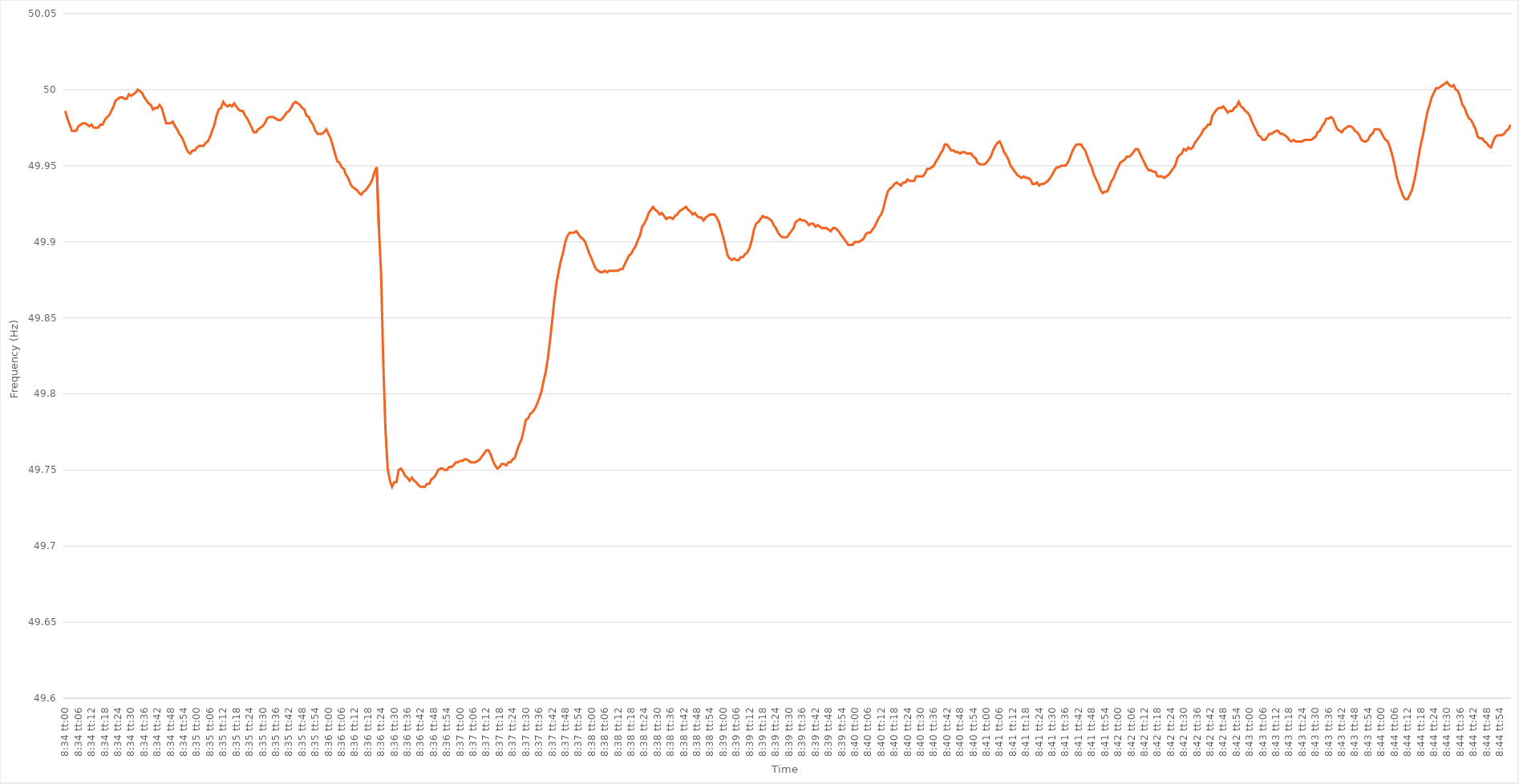
| Category | Series 0 |
|---|---|
| 0.35694444444444445 | 49.986 |
| 0.35695601851851855 | 49.981 |
| 0.3569675925925926 | 49.977 |
| 0.3569791666666667 | 49.973 |
| 0.3569907407407407 | 49.973 |
| 0.35700231481481487 | 49.973 |
| 0.3570138888888889 | 49.976 |
| 0.35702546296296295 | 49.977 |
| 0.35703703703703704 | 49.978 |
| 0.3570486111111111 | 49.978 |
| 0.3570601851851852 | 49.977 |
| 0.3570717592592592 | 49.976 |
| 0.35708333333333336 | 49.977 |
| 0.3570949074074074 | 49.975 |
| 0.3571064814814815 | 49.975 |
| 0.35711805555555554 | 49.975 |
| 0.35712962962962963 | 49.977 |
| 0.35714120370370367 | 49.977 |
| 0.3571527777777778 | 49.98 |
| 0.35716435185185186 | 49.982 |
| 0.35717592592592595 | 49.983 |
| 0.3571875 | 49.986 |
| 0.3571990740740741 | 49.989 |
| 0.3572106481481481 | 49.993 |
| 0.3572222222222223 | 49.994 |
| 0.3572337962962963 | 49.995 |
| 0.35724537037037035 | 49.995 |
| 0.35725694444444445 | 49.994 |
| 0.3572685185185185 | 49.994 |
| 0.3572800925925926 | 49.997 |
| 0.3572916666666666 | 49.996 |
| 0.35730324074074077 | 49.997 |
| 0.3573148148148148 | 49.998 |
| 0.3573263888888889 | 50 |
| 0.35733796296296294 | 49.999 |
| 0.35734953703703703 | 49.998 |
| 0.3573611111111111 | 49.995 |
| 0.3573726851851852 | 49.993 |
| 0.35738425925925926 | 49.991 |
| 0.35739583333333336 | 49.99 |
| 0.3574074074074074 | 49.987 |
| 0.3574189814814815 | 49.988 |
| 0.35743055555555553 | 49.988 |
| 0.3574421296296297 | 49.99 |
| 0.3574537037037037 | 49.988 |
| 0.3574652777777778 | 49.983 |
| 0.35747685185185185 | 49.978 |
| 0.3574884259259259 | 49.978 |
| 0.3575 | 49.978 |
| 0.357511574074074 | 49.979 |
| 0.3575231481481482 | 49.976 |
| 0.3575347222222222 | 49.974 |
| 0.3575462962962963 | 49.971 |
| 0.35755787037037035 | 49.969 |
| 0.35756944444444444 | 49.966 |
| 0.3575810185185185 | 49.962 |
| 0.35759259259259263 | 49.959 |
| 0.35760416666666667 | 49.958 |
| 0.35761574074074076 | 49.96 |
| 0.3576273148148148 | 49.96 |
| 0.3576388888888889 | 49.962 |
| 0.35765046296296293 | 49.963 |
| 0.3576620370370371 | 49.963 |
| 0.3576736111111111 | 49.963 |
| 0.3576851851851852 | 49.965 |
| 0.35769675925925926 | 49.966 |
| 0.35770833333333335 | 49.969 |
| 0.3577199074074074 | 49.973 |
| 0.35773148148148143 | 49.977 |
| 0.3577430555555556 | 49.983 |
| 0.3577546296296296 | 49.987 |
| 0.3577662037037037 | 49.988 |
| 0.35777777777777775 | 49.992 |
| 0.35778935185185184 | 49.99 |
| 0.3578009259259259 | 49.989 |
| 0.35781250000000003 | 49.99 |
| 0.35782407407407407 | 49.989 |
| 0.35783564814814817 | 49.991 |
| 0.3578472222222222 | 49.989 |
| 0.3578587962962963 | 49.987 |
| 0.35787037037037034 | 49.986 |
| 0.3578819444444445 | 49.986 |
| 0.3578935185185185 | 49.983 |
| 0.3579050925925926 | 49.981 |
| 0.35791666666666666 | 49.978 |
| 0.35792824074074076 | 49.975 |
| 0.3579398148148148 | 49.972 |
| 0.35795138888888894 | 49.972 |
| 0.357962962962963 | 49.974 |
| 0.357974537037037 | 49.975 |
| 0.3579861111111111 | 49.976 |
| 0.35799768518518515 | 49.978 |
| 0.35800925925925925 | 49.981 |
| 0.3580208333333333 | 49.982 |
| 0.35803240740740744 | 49.982 |
| 0.3580439814814815 | 49.982 |
| 0.35805555555555557 | 49.981 |
| 0.3580671296296296 | 49.98 |
| 0.3580787037037037 | 49.98 |
| 0.35809027777777774 | 49.981 |
| 0.3581018518518519 | 49.983 |
| 0.35811342592592593 | 49.985 |
| 0.358125 | 49.986 |
| 0.35813657407407407 | 49.988 |
| 0.35814814814814816 | 49.991 |
| 0.3581597222222222 | 49.992 |
| 0.35817129629629635 | 49.991 |
| 0.3581828703703704 | 49.99 |
| 0.3581944444444444 | 49.988 |
| 0.3582060185185185 | 49.987 |
| 0.35821759259259256 | 49.983 |
| 0.35822916666666665 | 49.982 |
| 0.3582407407407407 | 49.979 |
| 0.35825231481481484 | 49.977 |
| 0.3582638888888889 | 49.973 |
| 0.358275462962963 | 49.971 |
| 0.358287037037037 | 49.971 |
| 0.3582986111111111 | 49.971 |
| 0.35831018518518515 | 49.972 |
| 0.3583217592592593 | 49.974 |
| 0.35833333333333334 | 49.971 |
| 0.35834490740740743 | 49.968 |
| 0.35835648148148147 | 49.963 |
| 0.35836805555555556 | 49.958 |
| 0.3583796296296296 | 49.953 |
| 0.35839120370370375 | 49.952 |
| 0.3584027777777778 | 49.949 |
| 0.3584143518518519 | 49.948 |
| 0.3584259259259259 | 49.944 |
| 0.35843749999999996 | 49.942 |
| 0.35844907407407406 | 49.938 |
| 0.3584606481481481 | 49.936 |
| 0.35847222222222225 | 49.935 |
| 0.3584837962962963 | 49.934 |
| 0.3584953703703704 | 49.932 |
| 0.3585069444444444 | 49.931 |
| 0.3585185185185185 | 49.933 |
| 0.35853009259259255 | 49.934 |
| 0.3585416666666667 | 49.936 |
| 0.35855324074074074 | 49.938 |
| 0.35856481481481484 | 49.941 |
| 0.3585763888888889 | 49.946 |
| 0.35858796296296297 | 49.949 |
| 0.358599537037037 | 49.909 |
| 0.35861111111111116 | 49.879 |
| 0.3586226851851852 | 49.82 |
| 0.3586342592592593 | 49.776 |
| 0.35864583333333333 | 49.751 |
| 0.3586574074074074 | 49.743 |
| 0.35866898148148146 | 49.739 |
| 0.3586805555555555 | 49.742 |
| 0.35869212962962965 | 49.742 |
| 0.3587037037037037 | 49.75 |
| 0.3587152777777778 | 49.751 |
| 0.3587268518518518 | 49.749 |
| 0.3587384259259259 | 49.746 |
| 0.35874999999999996 | 49.745 |
| 0.3587615740740741 | 49.743 |
| 0.35877314814814815 | 49.745 |
| 0.35878472222222224 | 49.743 |
| 0.3587962962962963 | 49.742 |
| 0.3588078703703704 | 49.74 |
| 0.3588194444444444 | 49.739 |
| 0.35883101851851856 | 49.739 |
| 0.3588425925925926 | 49.739 |
| 0.3588541666666667 | 49.741 |
| 0.35886574074074074 | 49.741 |
| 0.35887731481481483 | 49.744 |
| 0.35888888888888887 | 49.745 |
| 0.358900462962963 | 49.747 |
| 0.35891203703703706 | 49.75 |
| 0.3589236111111111 | 49.751 |
| 0.3589351851851852 | 49.751 |
| 0.35894675925925923 | 49.75 |
| 0.3589583333333333 | 49.75 |
| 0.35896990740740736 | 49.752 |
| 0.3589814814814815 | 49.752 |
| 0.35899305555555555 | 49.753 |
| 0.35900462962962965 | 49.755 |
| 0.3590162037037037 | 49.755 |
| 0.3590277777777778 | 49.756 |
| 0.3590393518518518 | 49.756 |
| 0.35905092592592597 | 49.757 |
| 0.3590625 | 49.757 |
| 0.3590740740740741 | 49.756 |
| 0.35908564814814814 | 49.755 |
| 0.35909722222222223 | 49.755 |
| 0.3591087962962963 | 49.755 |
| 0.3591203703703704 | 49.756 |
| 0.35913194444444446 | 49.757 |
| 0.3591435185185185 | 49.759 |
| 0.3591550925925926 | 49.761 |
| 0.35916666666666663 | 49.763 |
| 0.35917824074074073 | 49.763 |
| 0.35918981481481477 | 49.76 |
| 0.3592013888888889 | 49.756 |
| 0.35921296296296296 | 49.753 |
| 0.35922453703703705 | 49.751 |
| 0.3592361111111111 | 49.752 |
| 0.3592476851851852 | 49.754 |
| 0.3592592592592592 | 49.754 |
| 0.3592708333333334 | 49.753 |
| 0.3592824074074074 | 49.755 |
| 0.3592939814814815 | 49.755 |
| 0.35930555555555554 | 49.757 |
| 0.35931712962962964 | 49.758 |
| 0.3593287037037037 | 49.763 |
| 0.35934027777777783 | 49.767 |
| 0.35935185185185187 | 49.77 |
| 0.35936342592592596 | 49.776 |
| 0.359375 | 49.783 |
| 0.35938657407407404 | 49.784 |
| 0.35939814814814813 | 49.787 |
| 0.35940972222222217 | 49.788 |
| 0.3594212962962963 | 49.79 |
| 0.35943287037037036 | 49.793 |
| 0.35944444444444446 | 49.797 |
| 0.3594560185185185 | 49.801 |
| 0.3594675925925926 | 49.808 |
| 0.3594791666666666 | 49.814 |
| 0.3594907407407408 | 49.823 |
| 0.3595023148148148 | 49.835 |
| 0.3595138888888889 | 49.848 |
| 0.35952546296296295 | 49.862 |
| 0.35953703703703704 | 49.873 |
| 0.3595486111111111 | 49.881 |
| 0.35956018518518523 | 49.888 |
| 0.35957175925925927 | 49.893 |
| 0.35958333333333337 | 49.9 |
| 0.3595949074074074 | 49.904 |
| 0.3596064814814815 | 49.906 |
| 0.35961805555555554 | 49.906 |
| 0.3596296296296296 | 49.906 |
| 0.3596412037037037 | 49.907 |
| 0.35965277777777777 | 49.905 |
| 0.35966435185185186 | 49.903 |
| 0.3596759259259259 | 49.902 |
| 0.3596875 | 49.9 |
| 0.35969907407407403 | 49.896 |
| 0.3597106481481482 | 49.892 |
| 0.3597222222222222 | 49.889 |
| 0.3597337962962963 | 49.885 |
| 0.35974537037037035 | 49.882 |
| 0.35975694444444445 | 49.881 |
| 0.3597685185185185 | 49.88 |
| 0.35978009259259264 | 49.88 |
| 0.3597916666666667 | 49.881 |
| 0.35980324074074077 | 49.88 |
| 0.3598148148148148 | 49.881 |
| 0.3598263888888889 | 49.881 |
| 0.35983796296296294 | 49.881 |
| 0.359849537037037 | 49.881 |
| 0.35986111111111113 | 49.881 |
| 0.35987268518518517 | 49.882 |
| 0.35988425925925926 | 49.882 |
| 0.3598958333333333 | 49.885 |
| 0.3599074074074074 | 49.888 |
| 0.35991898148148144 | 49.891 |
| 0.3599305555555556 | 49.892 |
| 0.3599421296296296 | 49.895 |
| 0.3599537037037037 | 49.897 |
| 0.35996527777777776 | 49.901 |
| 0.35997685185185185 | 49.904 |
| 0.3599884259259259 | 49.91 |
| 0.36000000000000004 | 49.912 |
| 0.3600115740740741 | 49.915 |
| 0.3600231481481482 | 49.919 |
| 0.3600347222222222 | 49.921 |
| 0.3600462962962963 | 49.923 |
| 0.36005787037037035 | 49.921 |
| 0.3600694444444445 | 49.92 |
| 0.36008101851851854 | 49.918 |
| 0.3600925925925926 | 49.919 |
| 0.36010416666666667 | 49.917 |
| 0.3601157407407407 | 49.915 |
| 0.3601273148148148 | 49.916 |
| 0.36013888888888884 | 49.916 |
| 0.360150462962963 | 49.915 |
| 0.36016203703703703 | 49.917 |
| 0.3601736111111111 | 49.918 |
| 0.36018518518518516 | 49.92 |
| 0.36019675925925926 | 49.921 |
| 0.3602083333333333 | 49.922 |
| 0.36021990740740745 | 49.923 |
| 0.3602314814814815 | 49.921 |
| 0.3602430555555556 | 49.92 |
| 0.3602546296296296 | 49.918 |
| 0.3602662037037037 | 49.919 |
| 0.36027777777777775 | 49.917 |
| 0.3602893518518519 | 49.916 |
| 0.36030092592592594 | 49.916 |
| 0.36031250000000004 | 49.914 |
| 0.3603240740740741 | 49.916 |
| 0.3603356481481481 | 49.917 |
| 0.3603472222222222 | 49.918 |
| 0.36035879629629625 | 49.918 |
| 0.3603703703703704 | 49.918 |
| 0.36038194444444444 | 49.916 |
| 0.36039351851851853 | 49.913 |
| 0.36040509259259257 | 49.908 |
| 0.36041666666666666 | 49.903 |
| 0.3604282407407407 | 49.897 |
| 0.36043981481481485 | 49.891 |
| 0.3604513888888889 | 49.889 |
| 0.360462962962963 | 49.888 |
| 0.360474537037037 | 49.889 |
| 0.3604861111111111 | 49.888 |
| 0.36049768518518516 | 49.888 |
| 0.3605092592592593 | 49.89 |
| 0.36052083333333335 | 49.89 |
| 0.36053240740740744 | 49.892 |
| 0.3605439814814815 | 49.893 |
| 0.3605555555555556 | 49.896 |
| 0.3605671296296296 | 49.901 |
| 0.36057870370370365 | 49.908 |
| 0.3605902777777778 | 49.912 |
| 0.36060185185185184 | 49.913 |
| 0.36061342592592593 | 49.915 |
| 0.360625 | 49.917 |
| 0.36063657407407407 | 49.916 |
| 0.3606481481481481 | 49.916 |
| 0.36065972222222226 | 49.915 |
| 0.3606712962962963 | 49.914 |
| 0.3606828703703704 | 49.911 |
| 0.36069444444444443 | 49.909 |
| 0.3607060185185185 | 49.906 |
| 0.36071759259259256 | 49.904 |
| 0.3607291666666667 | 49.903 |
| 0.36074074074074075 | 49.903 |
| 0.36075231481481485 | 49.903 |
| 0.3607638888888889 | 49.905 |
| 0.360775462962963 | 49.907 |
| 0.360787037037037 | 49.909 |
| 0.36079861111111106 | 49.913 |
| 0.3608101851851852 | 49.914 |
| 0.36082175925925924 | 49.915 |
| 0.36083333333333334 | 49.914 |
| 0.3608449074074074 | 49.914 |
| 0.3608564814814815 | 49.913 |
| 0.3608680555555555 | 49.911 |
| 0.36087962962962966 | 49.912 |
| 0.3608912037037037 | 49.912 |
| 0.3609027777777778 | 49.91 |
| 0.36091435185185183 | 49.911 |
| 0.36092592592592593 | 49.91 |
| 0.36093749999999997 | 49.909 |
| 0.3609490740740741 | 49.909 |
| 0.36096064814814816 | 49.909 |
| 0.36097222222222225 | 49.908 |
| 0.3609837962962963 | 49.907 |
| 0.3609953703703704 | 49.909 |
| 0.3610069444444444 | 49.909 |
| 0.36101851851851857 | 49.908 |
| 0.3610300925925926 | 49.906 |
| 0.36104166666666665 | 49.904 |
| 0.36105324074074074 | 49.902 |
| 0.3610648148148148 | 49.9 |
| 0.3610763888888889 | 49.898 |
| 0.3610879629629629 | 49.898 |
| 0.36109953703703707 | 49.898 |
| 0.3611111111111111 | 49.9 |
| 0.3611226851851852 | 49.9 |
| 0.36113425925925924 | 49.9 |
| 0.36114583333333333 | 49.901 |
| 0.36115740740740737 | 49.902 |
| 0.3611689814814815 | 49.905 |
| 0.36118055555555556 | 49.906 |
| 0.36119212962962965 | 49.906 |
| 0.3612037037037037 | 49.908 |
| 0.3612152777777778 | 49.91 |
| 0.3612268518518518 | 49.913 |
| 0.361238425925926 | 49.916 |
| 0.36125 | 49.918 |
| 0.3612615740740741 | 49.922 |
| 0.36127314814814815 | 49.928 |
| 0.3612847222222222 | 49.933 |
| 0.3612962962962963 | 49.935 |
| 0.3613078703703703 | 49.936 |
| 0.36131944444444447 | 49.938 |
| 0.3613310185185185 | 49.939 |
| 0.3613425925925926 | 49.938 |
| 0.36135416666666664 | 49.937 |
| 0.36136574074074074 | 49.939 |
| 0.3613773148148148 | 49.939 |
| 0.3613888888888889 | 49.941 |
| 0.36140046296296297 | 49.94 |
| 0.36141203703703706 | 49.94 |
| 0.3614236111111111 | 49.94 |
| 0.3614351851851852 | 49.943 |
| 0.36144675925925923 | 49.943 |
| 0.3614583333333334 | 49.943 |
| 0.3614699074074074 | 49.943 |
| 0.3614814814814815 | 49.945 |
| 0.36149305555555555 | 49.948 |
| 0.36150462962962965 | 49.948 |
| 0.3615162037037037 | 49.949 |
| 0.3615277777777777 | 49.95 |
| 0.3615393518518519 | 49.953 |
| 0.3615509259259259 | 49.955 |
| 0.3615625 | 49.958 |
| 0.36157407407407405 | 49.96 |
| 0.36158564814814814 | 49.964 |
| 0.3615972222222222 | 49.964 |
| 0.36160879629629633 | 49.962 |
| 0.36162037037037037 | 49.96 |
| 0.36163194444444446 | 49.96 |
| 0.3616435185185185 | 49.959 |
| 0.3616550925925926 | 49.959 |
| 0.36166666666666664 | 49.958 |
| 0.3616782407407408 | 49.959 |
| 0.3616898148148148 | 49.959 |
| 0.3617013888888889 | 49.958 |
| 0.36171296296296296 | 49.958 |
| 0.36172453703703705 | 49.958 |
| 0.3617361111111111 | 49.956 |
| 0.36174768518518513 | 49.955 |
| 0.3617592592592593 | 49.952 |
| 0.3617708333333333 | 49.951 |
| 0.3617824074074074 | 49.951 |
| 0.36179398148148145 | 49.951 |
| 0.36180555555555555 | 49.952 |
| 0.3618171296296296 | 49.954 |
| 0.36182870370370374 | 49.956 |
| 0.3618402777777778 | 49.96 |
| 0.36185185185185187 | 49.963 |
| 0.3618634259259259 | 49.965 |
| 0.361875 | 49.966 |
| 0.36188657407407404 | 49.963 |
| 0.3618981481481482 | 49.959 |
| 0.36190972222222223 | 49.957 |
| 0.3619212962962963 | 49.954 |
| 0.36193287037037036 | 49.95 |
| 0.36194444444444446 | 49.948 |
| 0.3619560185185185 | 49.946 |
| 0.36196759259259265 | 49.944 |
| 0.3619791666666667 | 49.943 |
| 0.3619907407407407 | 49.942 |
| 0.3620023148148148 | 49.943 |
| 0.36201388888888886 | 49.942 |
| 0.36202546296296295 | 49.942 |
| 0.362037037037037 | 49.941 |
| 0.36204861111111114 | 49.938 |
| 0.3620601851851852 | 49.938 |
| 0.3620717592592593 | 49.939 |
| 0.3620833333333333 | 49.937 |
| 0.3620949074074074 | 49.938 |
| 0.36210648148148145 | 49.938 |
| 0.3621180555555556 | 49.939 |
| 0.36212962962962963 | 49.94 |
| 0.36214120370370373 | 49.942 |
| 0.36215277777777777 | 49.944 |
| 0.36216435185185186 | 49.947 |
| 0.3621759259259259 | 49.949 |
| 0.36218750000000005 | 49.949 |
| 0.3621990740740741 | 49.95 |
| 0.3622106481481482 | 49.95 |
| 0.3622222222222222 | 49.95 |
| 0.36223379629629626 | 49.952 |
| 0.36224537037037036 | 49.955 |
| 0.3622569444444444 | 49.959 |
| 0.36226851851851855 | 49.962 |
| 0.3622800925925926 | 49.964 |
| 0.3622916666666667 | 49.964 |
| 0.3623032407407407 | 49.964 |
| 0.3623148148148148 | 49.962 |
| 0.36232638888888885 | 49.96 |
| 0.362337962962963 | 49.956 |
| 0.36234953703703704 | 49.952 |
| 0.36236111111111113 | 49.949 |
| 0.3623726851851852 | 49.944 |
| 0.36238425925925927 | 49.941 |
| 0.3623958333333333 | 49.938 |
| 0.36240740740740746 | 49.934 |
| 0.3624189814814815 | 49.932 |
| 0.3624305555555556 | 49.933 |
| 0.36244212962962963 | 49.933 |
| 0.36245370370370367 | 49.936 |
| 0.36246527777777776 | 49.94 |
| 0.3624768518518518 | 49.942 |
| 0.36248842592592595 | 49.946 |
| 0.3625 | 49.949 |
| 0.3625115740740741 | 49.952 |
| 0.3625231481481481 | 49.953 |
| 0.3625347222222222 | 49.954 |
| 0.36254629629629626 | 49.956 |
| 0.3625578703703704 | 49.956 |
| 0.36256944444444444 | 49.957 |
| 0.36258101851851854 | 49.959 |
| 0.3625925925925926 | 49.961 |
| 0.36260416666666667 | 49.961 |
| 0.3626157407407407 | 49.958 |
| 0.36262731481481486 | 49.955 |
| 0.3626388888888889 | 49.952 |
| 0.362650462962963 | 49.949 |
| 0.36266203703703703 | 49.947 |
| 0.3626736111111111 | 49.947 |
| 0.36268518518518517 | 49.946 |
| 0.3626967592592592 | 49.946 |
| 0.36270833333333335 | 49.943 |
| 0.3627199074074074 | 49.943 |
| 0.3627314814814815 | 49.943 |
| 0.3627430555555555 | 49.942 |
| 0.3627546296296296 | 49.943 |
| 0.36276620370370366 | 49.944 |
| 0.3627777777777778 | 49.946 |
| 0.36278935185185185 | 49.948 |
| 0.36280092592592594 | 49.95 |
| 0.3628125 | 49.955 |
| 0.3628240740740741 | 49.957 |
| 0.3628356481481481 | 49.958 |
| 0.36284722222222227 | 49.961 |
| 0.3628587962962963 | 49.96 |
| 0.3628703703703704 | 49.962 |
| 0.36288194444444444 | 49.961 |
| 0.36289351851851853 | 49.962 |
| 0.36290509259259257 | 49.965 |
| 0.3629166666666667 | 49.967 |
| 0.36292824074074076 | 49.969 |
| 0.3629398148148148 | 49.971 |
| 0.3629513888888889 | 49.974 |
| 0.36296296296296293 | 49.975 |
| 0.362974537037037 | 49.977 |
| 0.36298611111111106 | 49.977 |
| 0.3629976851851852 | 49.983 |
| 0.36300925925925925 | 49.985 |
| 0.36302083333333335 | 49.987 |
| 0.3630324074074074 | 49.988 |
| 0.3630439814814815 | 49.988 |
| 0.3630555555555555 | 49.989 |
| 0.36306712962962967 | 49.987 |
| 0.3630787037037037 | 49.985 |
| 0.3630902777777778 | 49.986 |
| 0.36310185185185184 | 49.986 |
| 0.36311342592592594 | 49.988 |
| 0.363125 | 49.989 |
| 0.3631365740740741 | 49.992 |
| 0.36314814814814816 | 49.989 |
| 0.36315972222222226 | 49.988 |
| 0.3631712962962963 | 49.986 |
| 0.36318287037037034 | 49.985 |
| 0.36319444444444443 | 49.983 |
| 0.36320601851851847 | 49.979 |
| 0.3632175925925926 | 49.976 |
| 0.36322916666666666 | 49.973 |
| 0.36324074074074075 | 49.97 |
| 0.3632523148148148 | 49.969 |
| 0.3632638888888889 | 49.967 |
| 0.3632754629629629 | 49.967 |
| 0.3632870370370371 | 49.969 |
| 0.3632986111111111 | 49.971 |
| 0.3633101851851852 | 49.971 |
| 0.36332175925925925 | 49.972 |
| 0.36333333333333334 | 49.973 |
| 0.3633449074074074 | 49.973 |
| 0.36335648148148153 | 49.971 |
| 0.36336805555555557 | 49.971 |
| 0.36337962962962966 | 49.97 |
| 0.3633912037037037 | 49.969 |
| 0.36340277777777774 | 49.967 |
| 0.36341435185185184 | 49.966 |
| 0.3634259259259259 | 49.967 |
| 0.3634375 | 49.966 |
| 0.36344907407407406 | 49.966 |
| 0.36346064814814816 | 49.966 |
| 0.3634722222222222 | 49.966 |
| 0.3634837962962963 | 49.967 |
| 0.36349537037037033 | 49.967 |
| 0.3635069444444445 | 49.967 |
| 0.3635185185185185 | 49.967 |
| 0.3635300925925926 | 49.968 |
| 0.36354166666666665 | 49.969 |
| 0.36355324074074075 | 49.972 |
| 0.3635648148148148 | 49.973 |
| 0.36357638888888894 | 49.976 |
| 0.363587962962963 | 49.978 |
| 0.36359953703703707 | 49.981 |
| 0.3636111111111111 | 49.981 |
| 0.3636226851851852 | 49.982 |
| 0.36363425925925924 | 49.981 |
| 0.3636458333333333 | 49.977 |
| 0.36365740740740743 | 49.974 |
| 0.36366898148148147 | 49.973 |
| 0.36368055555555556 | 49.972 |
| 0.3636921296296296 | 49.974 |
| 0.3637037037037037 | 49.975 |
| 0.36371527777777773 | 49.976 |
| 0.3637268518518519 | 49.976 |
| 0.3637384259259259 | 49.975 |
| 0.36375 | 49.973 |
| 0.36376157407407406 | 49.972 |
| 0.36377314814814815 | 49.97 |
| 0.3637847222222222 | 49.967 |
| 0.36379629629629634 | 49.966 |
| 0.3638078703703704 | 49.966 |
| 0.3638194444444445 | 49.967 |
| 0.3638310185185185 | 49.97 |
| 0.3638425925925926 | 49.971 |
| 0.36385416666666665 | 49.974 |
| 0.3638657407407408 | 49.974 |
| 0.36387731481481483 | 49.974 |
| 0.3638888888888889 | 49.972 |
| 0.36390046296296297 | 49.969 |
| 0.363912037037037 | 49.967 |
| 0.3639236111111111 | 49.966 |
| 0.36393518518518514 | 49.962 |
| 0.3639467592592593 | 49.957 |
| 0.36395833333333333 | 49.951 |
| 0.3639699074074074 | 49.943 |
| 0.36398148148148146 | 49.938 |
| 0.36399305555555556 | 49.934 |
| 0.3640046296296296 | 49.93 |
| 0.36401620370370374 | 49.928 |
| 0.3640277777777778 | 49.928 |
| 0.3640393518518519 | 49.931 |
| 0.3640509259259259 | 49.934 |
| 0.3640625 | 49.94 |
| 0.36407407407407405 | 49.947 |
| 0.3640856481481482 | 49.956 |
| 0.36409722222222224 | 49.964 |
| 0.36410879629629633 | 49.97 |
| 0.36412037037037037 | 49.978 |
| 0.3641319444444444 | 49.985 |
| 0.3641435185185185 | 49.99 |
| 0.36415509259259254 | 49.995 |
| 0.3641666666666667 | 49.998 |
| 0.36417824074074073 | 50.001 |
| 0.3641898148148148 | 50.001 |
| 0.36420138888888887 | 50.002 |
| 0.36421296296296296 | 50.003 |
| 0.364224537037037 | 50.004 |
| 0.36423611111111115 | 50.005 |
| 0.3642476851851852 | 50.003 |
| 0.3642592592592593 | 50.002 |
| 0.3642708333333333 | 50.003 |
| 0.3642824074074074 | 50 |
| 0.36429398148148145 | 49.999 |
| 0.3643055555555556 | 49.995 |
| 0.36431712962962964 | 49.99 |
| 0.36432870370370374 | 49.988 |
| 0.3643402777777778 | 49.984 |
| 0.3643518518518518 | 49.981 |
| 0.3643634259259259 | 49.98 |
| 0.36437499999999995 | 49.977 |
| 0.3643865740740741 | 49.974 |
| 0.36439814814814814 | 49.969 |
| 0.36440972222222223 | 49.968 |
| 0.36442129629629627 | 49.968 |
| 0.36443287037037037 | 49.966 |
| 0.3644444444444444 | 49.965 |
| 0.36445601851851855 | 49.963 |
| 0.3644675925925926 | 49.962 |
| 0.3644791666666667 | 49.966 |
| 0.3644907407407407 | 49.969 |
| 0.3645023148148148 | 49.97 |
| 0.36451388888888886 | 49.97 |
| 0.364525462962963 | 49.97 |
| 0.36453703703703705 | 49.971 |
| 0.36454861111111114 | 49.973 |
| 0.3645601851851852 | 49.974 |
| 0.3645717592592593 | 49.977 |